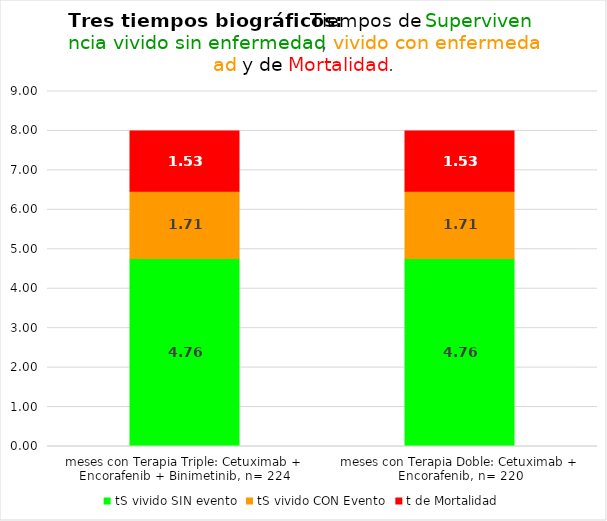
| Category | tS vivido SIN evento | tS vivido CON Evento | t de Mortalidad |
|---|---|---|---|
| meses con Terapia Triple: Cetuximab + Encorafenib + Binimetinib, n= 224 | 4.765 | 1.706 | 1.529 |
| meses con Terapia Doble: Cetuximab + Encorafenib, n= 220 | 4.765 | 1.706 | 1.529 |